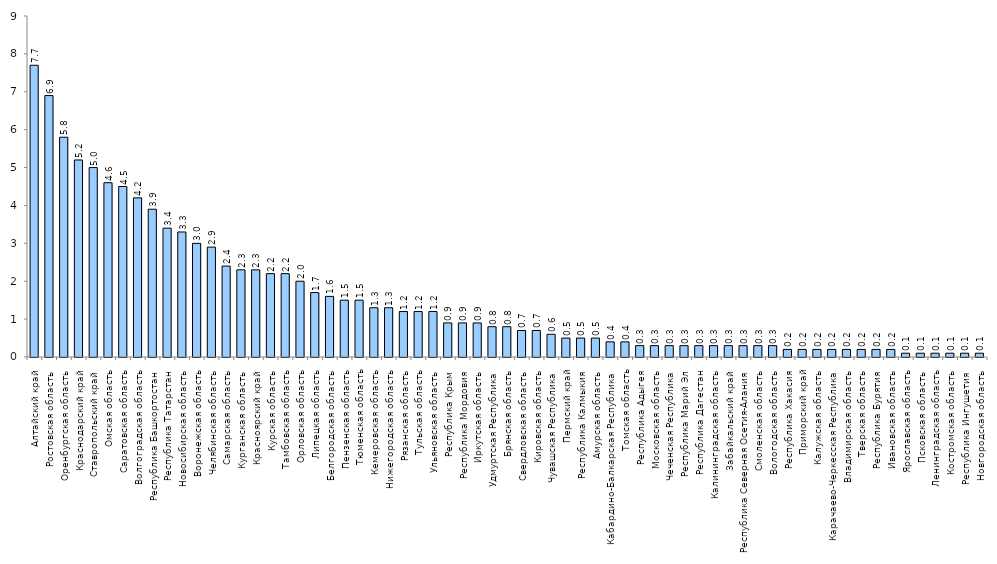
| Category | Series 0 |
|---|---|
| Алтайский край | 7.7 |
| Ростовская область | 6.9 |
| Оренбургская область | 5.8 |
| Краснодарский край | 5.2 |
| Ставропольский край | 5 |
| Омская область | 4.6 |
| Саратовская область | 4.5 |
| Волгоградская область | 4.2 |
| Республика Башкортостан | 3.9 |
| Республика Татарстан | 3.4 |
| Новосибирская область | 3.3 |
| Воронежская область | 3 |
| Челябинская область | 2.9 |
| Самарская область | 2.4 |
| Курганская область | 2.3 |
| Красноярский край | 2.3 |
| Курская область | 2.2 |
| Тамбовская область | 2.2 |
| Орловская область | 2 |
| Липецкая область | 1.7 |
| Белгородская область | 1.6 |
| Пензенская область | 1.5 |
| Тюменская область | 1.5 |
| Кемеровская область | 1.3 |
| Нижегородская область | 1.3 |
| Рязанская область | 1.2 |
| Тульская область | 1.2 |
| Ульяновская область | 1.2 |
| Республика Крым | 0.9 |
| Республика Мордовия | 0.9 |
| Иркутская область | 0.9 |
| Удмуртская Республика | 0.8 |
| Брянская область | 0.8 |
| Свердловская область | 0.7 |
| Кировская область | 0.7 |
| Чувашская Республика | 0.6 |
| Пермский край | 0.5 |
| Республика Калмыкия | 0.5 |
| Амурская область | 0.5 |
| Кабардино-Балкарская Республика | 0.4 |
| Томская область | 0.4 |
| Республика Адыгея | 0.3 |
| Московская область | 0.3 |
| Чеченская Республика | 0.3 |
| Республика Марий Эл | 0.3 |
| Республика Дагестан | 0.3 |
| Калининградская область | 0.3 |
| Забайкальский край | 0.3 |
| Республика Северная Осетия-Алания | 0.3 |
| Смоленская область | 0.3 |
| Вологодская область | 0.3 |
| Республика Хакасия | 0.2 |
| Приморский край | 0.2 |
| Калужская область | 0.2 |
| Карачаево-Черкесская Республика | 0.2 |
| Владимирская область | 0.2 |
| Тверская область | 0.2 |
| Республика Бурятия | 0.2 |
| Ивановская область | 0.2 |
| Ярославская область | 0.1 |
| Псковская область | 0.1 |
| Ленинградская область | 0.1 |
| Костромская область | 0.1 |
| Республика Ингушетия | 0.1 |
| Новгородская область | 0.1 |